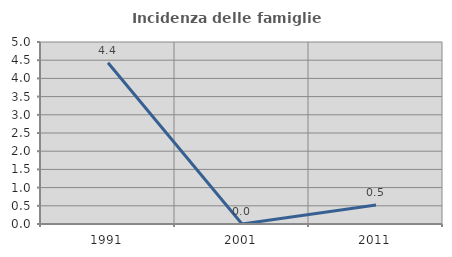
| Category | Incidenza delle famiglie numerose |
|---|---|
| 1991.0 | 4.43 |
| 2001.0 | 0 |
| 2011.0 | 0.521 |